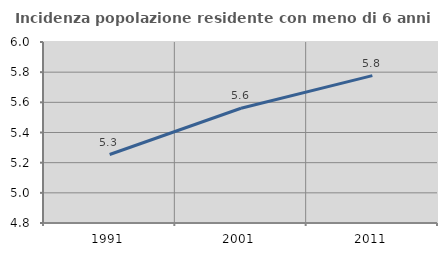
| Category | Incidenza popolazione residente con meno di 6 anni |
|---|---|
| 1991.0 | 5.254 |
| 2001.0 | 5.561 |
| 2011.0 | 5.777 |